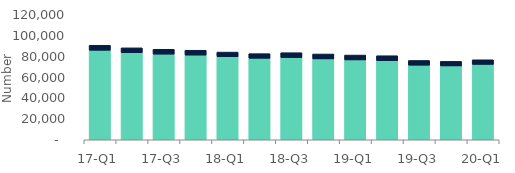
| Category | Homeowners | Buy-to-let |
|---|---|---|
| 17-Q1 | 85930 | 4810 |
| 17-Q2 | 83560 | 4700 |
| 17-Q3 | 82200 | 4690 |
| 17-Q4 | 81290 | 4670 |
| 18-Q1 | 79670 | 4500 |
| 18-Q2 | 78240 | 4440 |
| 18-Q3 | 78820 | 4770 |
| 18-Q4 | 77620 | 4720 |
| 19-Q1 | 76640 | 4680 |
| 19-Q2 | 75960 | 4720 |
| 19-Q3 | 71590 | 4550 |
| 19-Q4 | 70880 | 4390 |
| 20-Q1 | 72380 | 4420 |